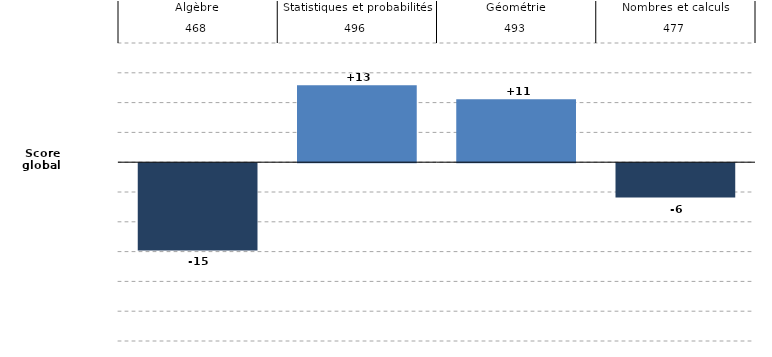
| Category | Series 0 |
|---|---|
| 0 | -14.628 |
| 1 | 12.892 |
| 2 | 10.566 |
| 3 | -5.766 |